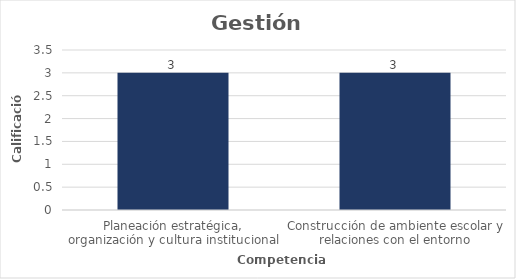
| Category | Series 0 |
|---|---|
| Planeación estratégica, organización y cultura institucional | 3 |
| Construcción de ambiente escolar y relaciones con el entorno | 3 |